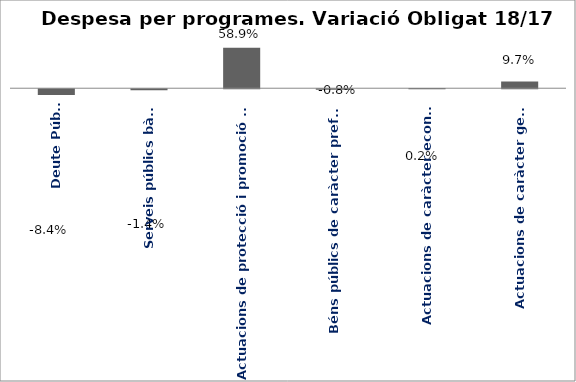
| Category | Series 0 |
|---|---|
| Deute Públic | -0.084 |
| Serveis públics bàsics | -0.014 |
| Actuacions de protecció i promoció social | 0.589 |
| Béns públics de caràcter preferent | -0.008 |
| Actuacions de caràcter econòmic | 0.002 |
| Actuacions de caràcter general | 0.097 |